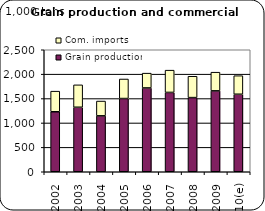
| Category | Grain production | Com. imports |
|---|---|---|
| 2002 | 1229.193 | 422.628 |
| 2003 | 1321.55 | 459.473 |
| 2004 | 1145.65 | 303.478 |
| 2005 | 1500.206 | 400.615 |
| 2006 | 1717.295 | 303.575 |
| 2007 | 1625.649 | 456.299 |
| 2008 | 1519.401 | 437.583 |
| 2009 | 1657.792 | 382.738 |
| 2010(e) | 1588.35 | 380.336 |